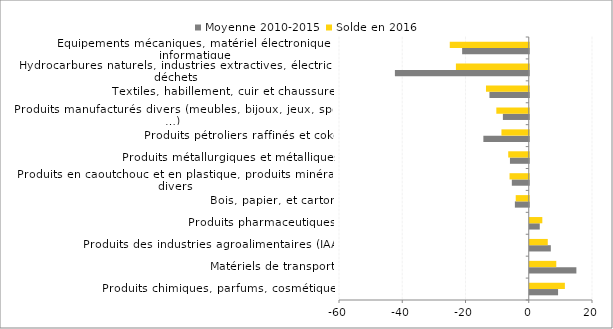
| Category | Moyenne 2010-2015 | Solde en 2016 |
|---|---|---|
| Produits chimiques, parfums, cosmétiques | 8.958 | 11.11 |
| Matériels de transport | 14.747 | 8.389 |
| Produits des industries agroalimentaires (IAA) | 6.664 | 5.699 |
| Produits pharmaceutiques | 3.164 | 3.974 |
| Bois, papier, et carton | -4.386 | -4.121 |
| Produits en caoutchouc et en plastique, produits minéraux divers | -5.352 | -6.069 |
| Produits métallurgiques et métalliques | -5.946 | -6.493 |
| Produits pétroliers raffinés et coke | -14.351 | -8.635 |
| Produits manufacturés divers (meubles, bijoux, jeux, sport, …) | -8.179 | -10.252 |
| Textiles, habillement, cuir et chaussures | -12.428 | -13.522 |
| Hydrocarbures naturels, industries extractives, électricité, déchets | -42.322 | -23.032 |
| Equipements mécaniques, matériel électronique et informatique | -21.064 | -24.977 |